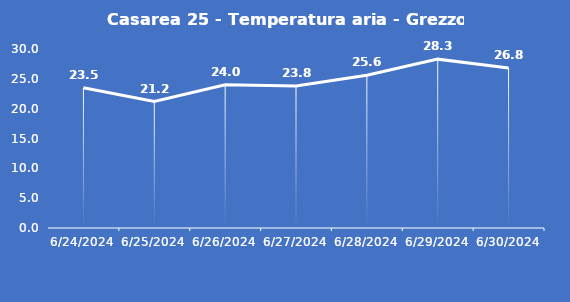
| Category | Casarea 25 - Temperatura aria - Grezzo (°C) |
|---|---|
| 6/24/24 | 23.5 |
| 6/25/24 | 21.2 |
| 6/26/24 | 24 |
| 6/27/24 | 23.8 |
| 6/28/24 | 25.6 |
| 6/29/24 | 28.3 |
| 6/30/24 | 26.8 |